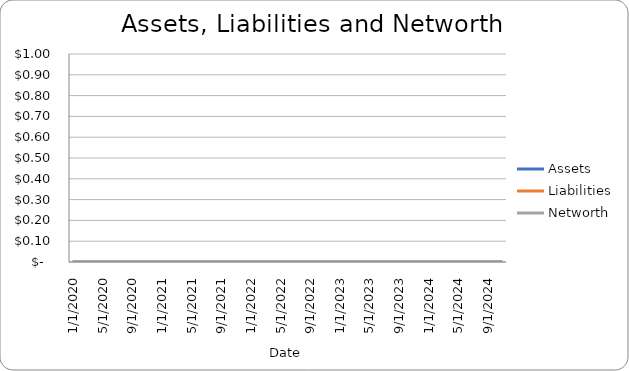
| Category | Assets | Liabilities | Networth |
|---|---|---|---|
| 1/1/20 | 0 | 0 | 0 |
| 2/1/20 | 0 | 0 | 0 |
| 3/1/20 | 0 | 0 | 0 |
| 4/1/20 | 0 | 0 | 0 |
| 5/1/20 | 0 | 0 | 0 |
| 6/1/20 | 0 | 0 | 0 |
| 7/1/20 | 0 | 0 | 0 |
| 8/1/20 | 0 | 0 | 0 |
| 9/1/20 | 0 | 0 | 0 |
| 10/1/20 | 0 | 0 | 0 |
| 11/1/20 | 0 | 0 | 0 |
| 12/1/20 | 0 | 0 | 0 |
| 1/1/21 | 0 | 0 | 0 |
| 2/1/21 | 0 | 0 | 0 |
| 3/1/21 | 0 | 0 | 0 |
| 4/1/21 | 0 | 0 | 0 |
| 5/1/21 | 0 | 0 | 0 |
| 6/1/21 | 0 | 0 | 0 |
| 7/1/21 | 0 | 0 | 0 |
| 8/1/21 | 0 | 0 | 0 |
| 9/1/21 | 0 | 0 | 0 |
| 10/1/21 | 0 | 0 | 0 |
| 11/1/21 | 0 | 0 | 0 |
| 12/1/21 | 0 | 0 | 0 |
| 1/1/22 | 0 | 0 | 0 |
| 2/1/22 | 0 | 0 | 0 |
| 3/1/22 | 0 | 0 | 0 |
| 4/1/22 | 0 | 0 | 0 |
| 5/1/22 | 0 | 0 | 0 |
| 6/1/22 | 0 | 0 | 0 |
| 7/1/22 | 0 | 0 | 0 |
| 8/1/22 | 0 | 0 | 0 |
| 9/1/22 | 0 | 0 | 0 |
| 10/1/22 | 0 | 0 | 0 |
| 11/1/22 | 0 | 0 | 0 |
| 12/1/22 | 0 | 0 | 0 |
| 1/1/23 | 0 | 0 | 0 |
| 2/1/23 | 0 | 0 | 0 |
| 3/1/23 | 0 | 0 | 0 |
| 4/1/23 | 0 | 0 | 0 |
| 5/1/23 | 0 | 0 | 0 |
| 6/1/23 | 0 | 0 | 0 |
| 7/1/23 | 0 | 0 | 0 |
| 8/1/23 | 0 | 0 | 0 |
| 9/1/23 | 0 | 0 | 0 |
| 10/1/23 | 0 | 0 | 0 |
| 11/1/23 | 0 | 0 | 0 |
| 12/1/23 | 0 | 0 | 0 |
| 1/1/24 | 0 | 0 | 0 |
| 2/1/24 | 0 | 0 | 0 |
| 3/1/24 | 0 | 0 | 0 |
| 4/1/24 | 0 | 0 | 0 |
| 5/1/24 | 0 | 0 | 0 |
| 6/1/24 | 0 | 0 | 0 |
| 7/1/24 | 0 | 0 | 0 |
| 8/1/24 | 0 | 0 | 0 |
| 9/1/24 | 0 | 0 | 0 |
| 10/1/24 | 0 | 0 | 0 |
| 11/1/24 | 0 | 0 | 0 |